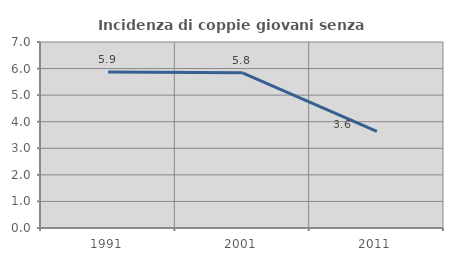
| Category | Incidenza di coppie giovani senza figli |
|---|---|
| 1991.0 | 5.872 |
| 2001.0 | 5.839 |
| 2011.0 | 3.637 |